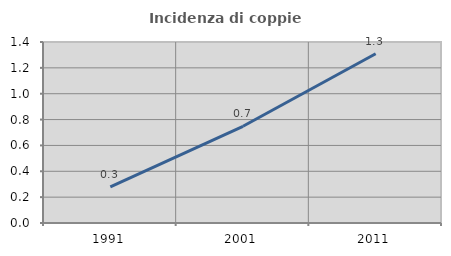
| Category | Incidenza di coppie miste |
|---|---|
| 1991.0 | 0.279 |
| 2001.0 | 0.748 |
| 2011.0 | 1.309 |